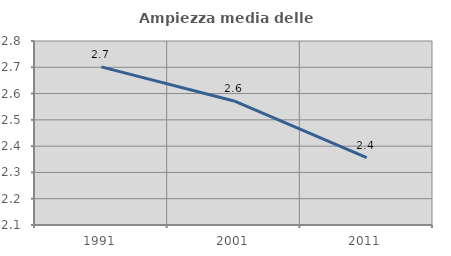
| Category | Ampiezza media delle famiglie |
|---|---|
| 1991.0 | 2.701 |
| 2001.0 | 2.572 |
| 2011.0 | 2.356 |